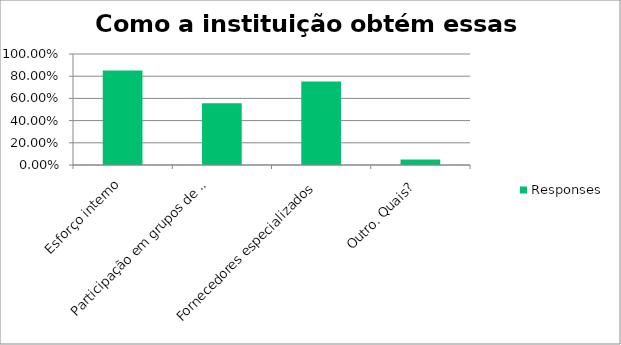
| Category | Responses |
|---|---|
| Esforço interno | 0.852 |
| Participação em grupos de 
compartilhamento de informações | 0.556 |
| Fornecedores especializados | 0.753 |
| Outro. Quais? | 0.049 |